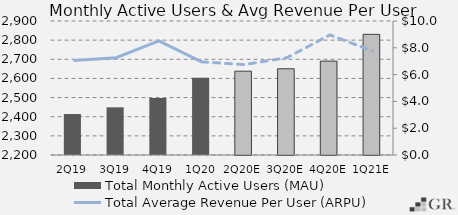
| Category | Total Monthly Active Users (MAU)  |
|---|---|
|  2Q19  | 2414 |
|  3Q19  | 2449 |
|  4Q19  | 2497.8 |
|  1Q20  | 2603 |
|  2Q20E  | 2637.83 |
|  3Q20E  | 2650.551 |
|  4Q20E  | 2690.516 |
|  1Q21E  | 2830.326 |